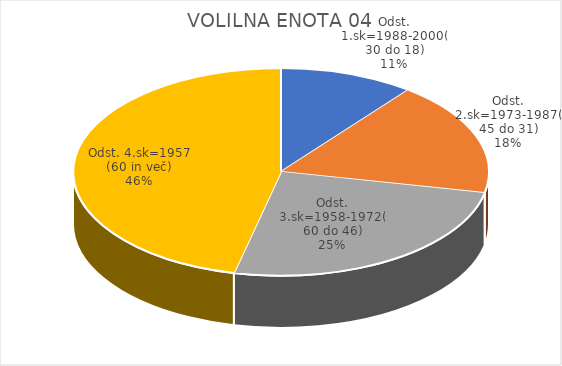
| Category | VOLILNA ENOTA 04 |
|---|---|
| Odst. 1.sk=1988-2000(30 do 18) | 3.21 |
| Odst. 2.sk=1973-1987(45 do 31) | 5.43 |
| Odst. 3.sk=1958-1972(60 do 46) | 7.75 |
| Odst. 4.sk=1957 (60 in več) | 14.17 |